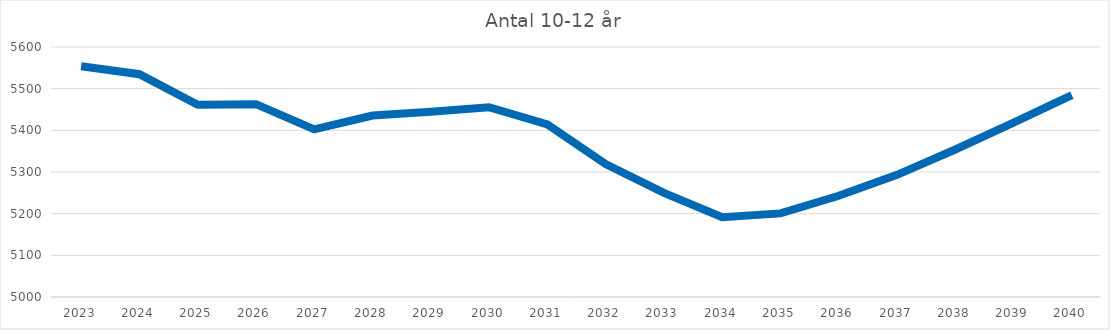
| Category | Antal 10-12 år |
|---|---|
| 2023.0 | 5554 |
| 2024.0 | 5534.654 |
| 2025.0 | 5461.236 |
| 2026.0 | 5462.803 |
| 2027.0 | 5402.45 |
| 2028.0 | 5435.408 |
| 2029.0 | 5444.775 |
| 2030.0 | 5455.458 |
| 2031.0 | 5414.232 |
| 2032.0 | 5318.822 |
| 2033.0 | 5250.041 |
| 2034.0 | 5191.57 |
| 2035.0 | 5200.639 |
| 2036.0 | 5243.03 |
| 2037.0 | 5293.161 |
| 2038.0 | 5354.095 |
| 2039.0 | 5418.241 |
| 2040.0 | 5484.675 |